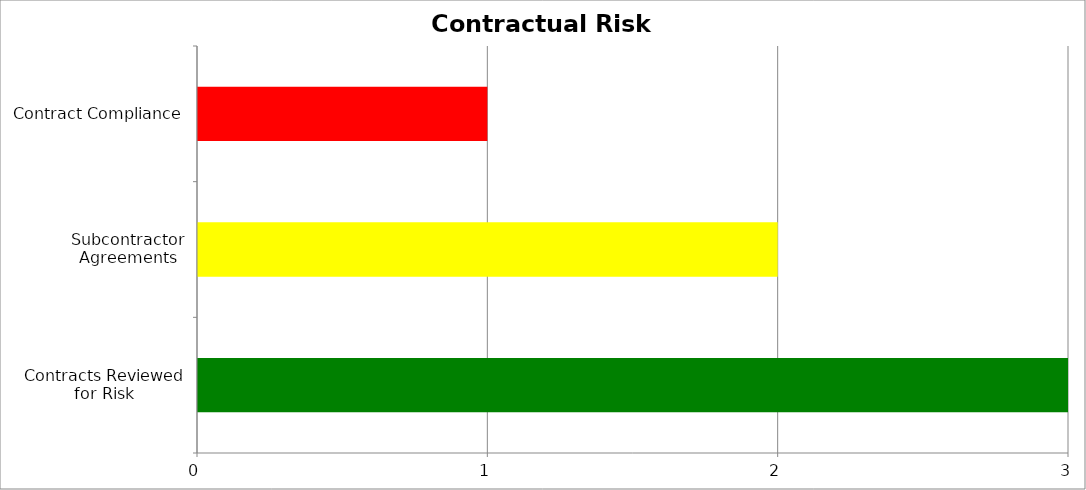
| Category | Low | Medium | High |
|---|---|---|---|
| Contracts Reviewed for Risk | 0 | 0 | 3 |
| Subcontractor Agreements | 0 | 2 | 0 |
| Contract Compliance | 1 | 0 | 0 |